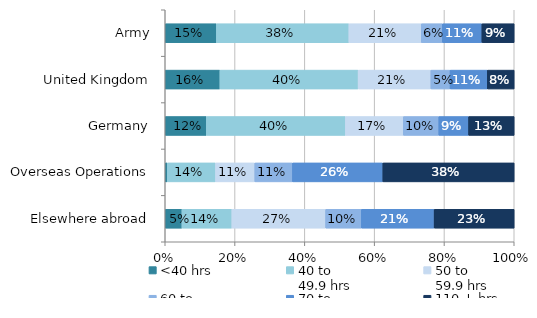
| Category | <40 hrs | 40 to 
49.9 hrs | 50 to 
59.9 hrs | 60 to 
69.9 hrs | 70 to 
109.9 hrs | 110 + hrs |
|---|---|---|---|---|---|---|
| Army | 0.147 | 0.38 | 0.207 | 0.061 | 0.113 | 0.093 |
| United Kingdom | 0.157 | 0.396 | 0.208 | 0.055 | 0.107 | 0.077 |
| Germany | 0.118 | 0.399 | 0.166 | 0.102 | 0.085 | 0.131 |
| Overseas Operations | 0.006 | 0.138 | 0.112 | 0.108 | 0.259 | 0.376 |
| Elsewhere abroad | 0.048 | 0.143 | 0.269 | 0.102 | 0.209 | 0.23 |